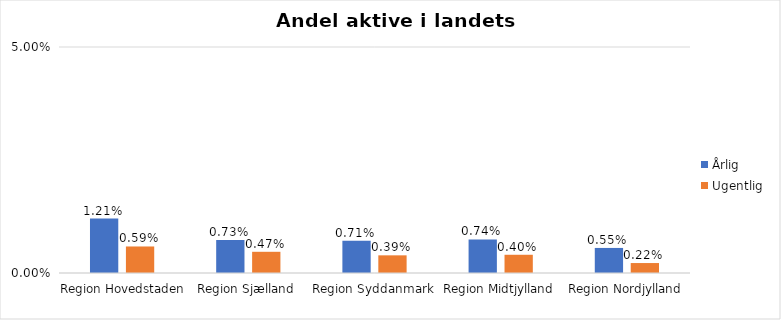
| Category | Årlig | Ugentlig |
|---|---|---|
| Region Hovedstaden | 0.012 | 0.006 |
| Region Sjælland | 0.007 | 0.005 |
| Region Syddanmark | 0.007 | 0.004 |
| Region Midtjylland | 0.007 | 0.004 |
| Region Nordjylland | 0.006 | 0.002 |